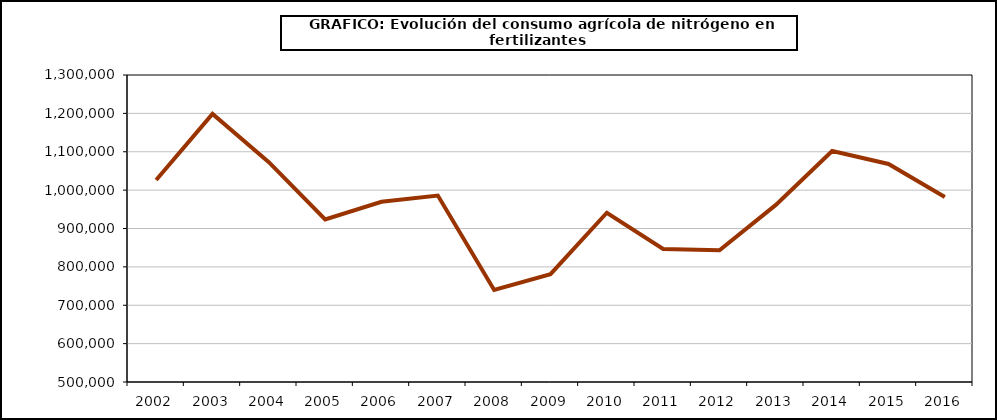
| Category | fertilizantes |
|---|---|
| 2002.0 | 1026546 |
| 2003.0 | 1198606 |
| 2004.0 | 1072949 |
| 2005.0 | 923764 |
| 2006.0 | 969783 |
| 2007.0 | 985857 |
| 2008.0 | 739757 |
| 2009.0 | 781069 |
| 2010.0 | 940984 |
| 2011.0 | 846697 |
| 2012.0 | 843410 |
| 2013.0 | 961507 |
| 2014.0 | 1101895 |
| 2015.0 | 1068103 |
| 2016.0 | 982155 |